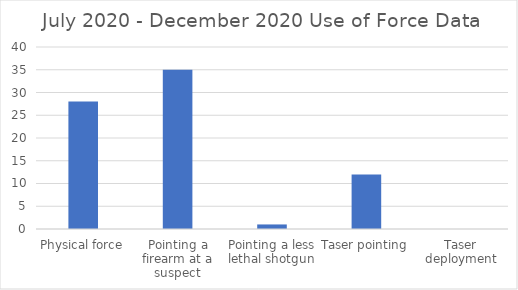
| Category | Series 0 |
|---|---|
| Physical force | 28 |
| Pointing a firearm at a suspect | 35 |
| Pointing a less lethal shotgun | 1 |
| Taser pointing | 12 |
| Taser deployment | 0 |